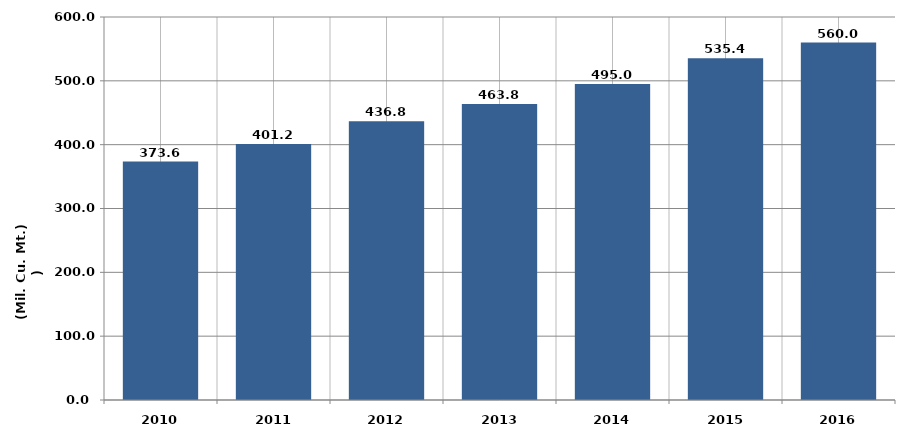
| Category |  انتاج المياه 
( مليون متر مكعب  ) Water Production
(Million Cubic Meters) |
|---|---|
| 2010 | 373.6 |
| 2011 | 401.2 |
| 2012 | 436.8 |
| 2013 | 463.8 |
| 2014 | 494.961 |
| 2015 | 535.4 |
| 2016 | 560 |